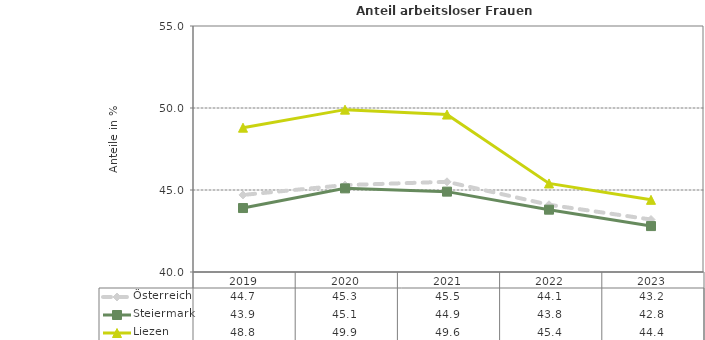
| Category | Österreich | Steiermark | Liezen |
|---|---|---|---|
| 2023.0 | 43.2 | 42.8 | 44.4 |
| 2022.0 | 44.1 | 43.8 | 45.4 |
| 2021.0 | 45.5 | 44.9 | 49.6 |
| 2020.0 | 45.3 | 45.1 | 49.9 |
| 2019.0 | 44.7 | 43.9 | 48.8 |